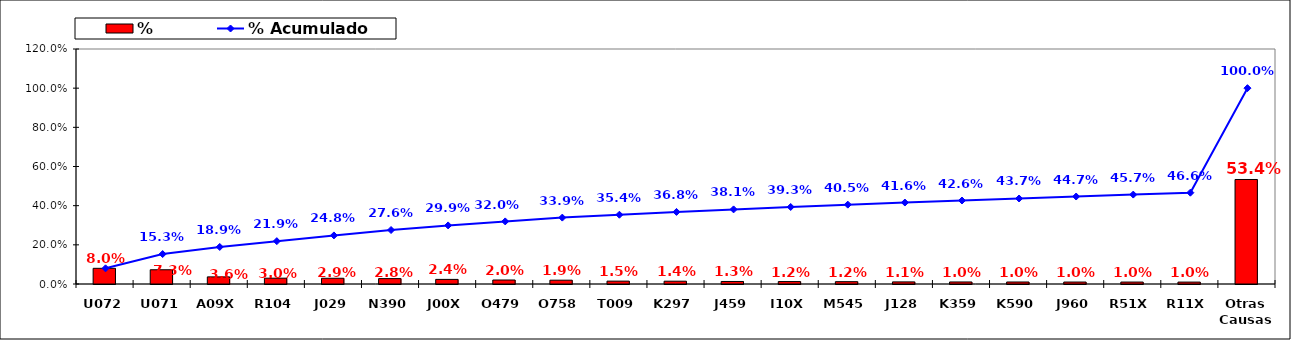
| Category | % |
|---|---|
| U072 | 0.08 |
| U071 | 0.073 |
| A09X | 0.036 |
| R104 | 0.03 |
| J029 | 0.029 |
| N390 | 0.028 |
| J00X | 0.024 |
| O479 | 0.02 |
| O758 | 0.019 |
| T009 | 0.015 |
| K297 | 0.014 |
| J459 | 0.013 |
| I10X | 0.012 |
| M545 | 0.012 |
| J128 | 0.011 |
| K359 | 0.01 |
| K590 | 0.01 |
| J960 | 0.01 |
| R51X | 0.01 |
| R11X | 0.01 |
| Otras Causas | 0.534 |